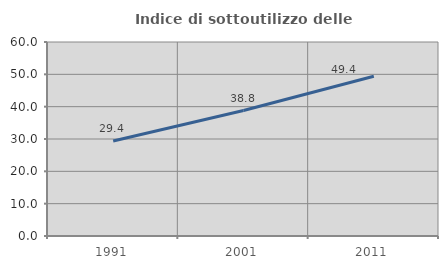
| Category | Indice di sottoutilizzo delle abitazioni  |
|---|---|
| 1991.0 | 29.394 |
| 2001.0 | 38.796 |
| 2011.0 | 49.416 |